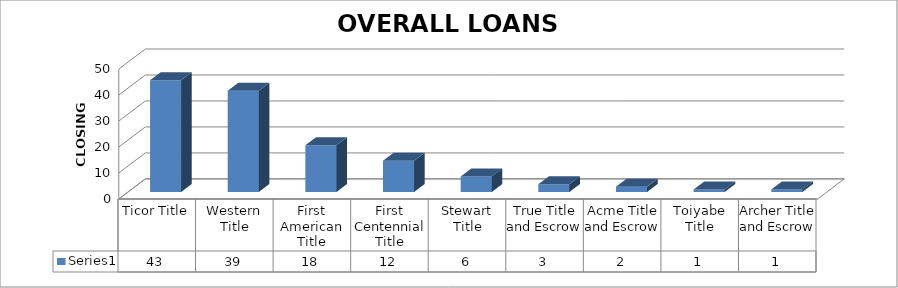
| Category | Series 0 |
|---|---|
| Ticor Title | 43 |
| Western Title | 39 |
| First American Title | 18 |
| First Centennial Title | 12 |
| Stewart Title | 6 |
| True Title and Escrow | 3 |
| Acme Title and Escrow | 2 |
| Toiyabe Title | 1 |
| Archer Title and Escrow | 1 |